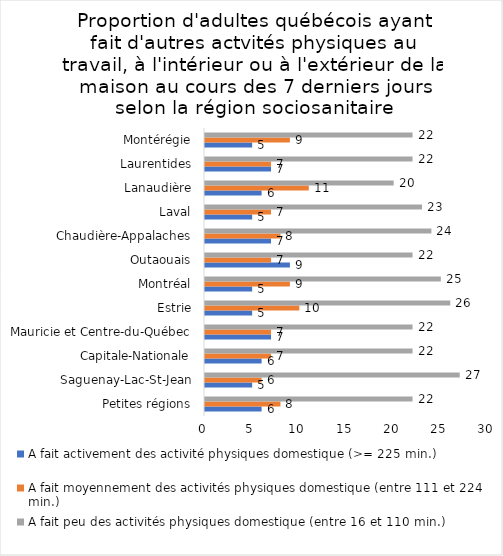
| Category | A fait activement des activité physiques domestique (>= 225 min.) | A fait moyennement des activités physiques domestique (entre 111 et 224 min.) | A fait peu des activités physiques domestique (entre 16 et 110 min.) |
|---|---|---|---|
| Petites régions | 6 | 8 | 22 |
| Saguenay-Lac-St-Jean | 5 | 6 | 27 |
| Capitale-Nationale | 6 | 7 | 22 |
| Mauricie et Centre-du-Québec | 7 | 7 | 22 |
| Estrie | 5 | 10 | 26 |
| Montréal | 5 | 9 | 25 |
| Outaouais | 9 | 7 | 22 |
| Chaudière-Appalaches | 7 | 8 | 24 |
| Laval | 5 | 7 | 23 |
| Lanaudière | 6 | 11 | 20 |
| Laurentides | 7 | 7 | 22 |
| Montérégie | 5 | 9 | 22 |